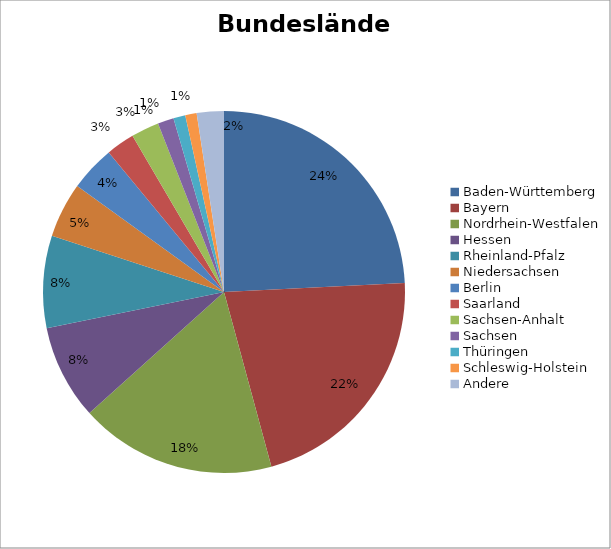
| Category | Series 0 |
|---|---|
| Baden-Württemberg | 4103 |
| Bayern | 3653 |
| Nordrhein-Westfalen | 2975 |
| Hessen | 1433 |
| Rheinland-Pfalz | 1393 |
| Niedersachsen | 835 |
| Berlin | 689 |
| Saarland | 432 |
| Sachsen-Anhalt | 423 |
| Sachsen | 243 |
| Thüringen | 181 |
| Schleswig-Holstein | 172 |
| Andere | 410 |